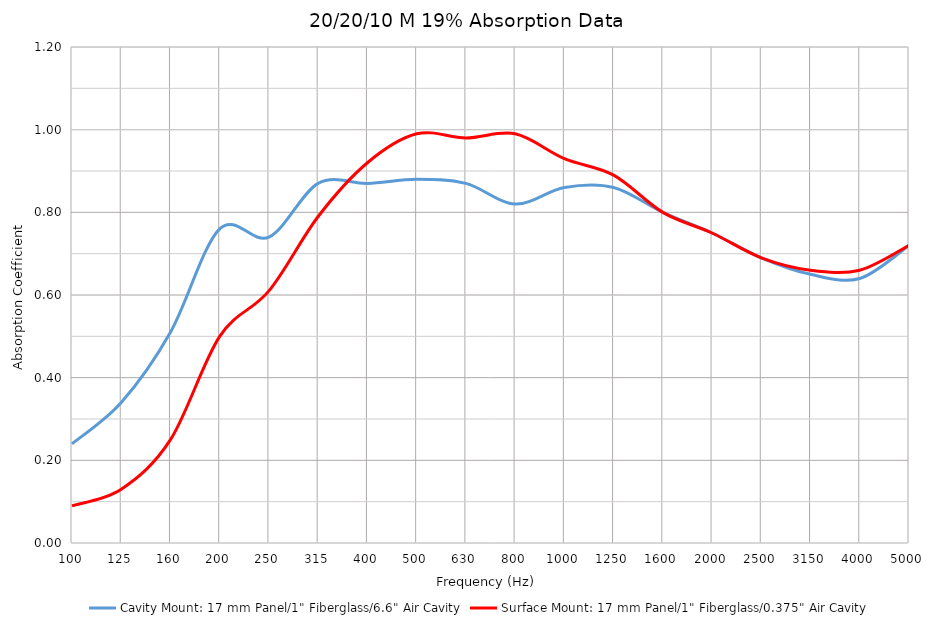
| Category | Cavity Mount: 17 mm Panel/1" Fiberglass/6.6" Air Cavity | Surface Mount: 17 mm Panel/1" Fiberglass/0.375" Air Cavity |
|---|---|---|
| 100.0 | 0.24 | 0.09 |
| 125.0 | 0.34 | 0.13 |
| 160.0 | 0.51 | 0.25 |
| 200.0 | 0.76 | 0.5 |
| 250.0 | 0.74 | 0.61 |
| 315.0 | 0.87 | 0.79 |
| 400.0 | 0.87 | 0.92 |
| 500.0 | 0.88 | 0.99 |
| 630.0 | 0.87 | 0.98 |
| 800.0 | 0.82 | 0.99 |
| 1000.0 | 0.86 | 0.93 |
| 1250.0 | 0.86 | 0.89 |
| 1600.0 | 0.8 | 0.8 |
| 2000.0 | 0.75 | 0.75 |
| 2500.0 | 0.69 | 0.69 |
| 3150.0 | 0.65 | 0.66 |
| 4000.0 | 0.64 | 0.66 |
| 5000.0 | 0.72 | 0.72 |